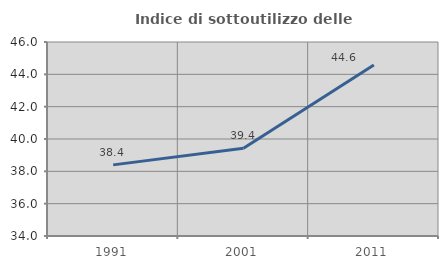
| Category | Indice di sottoutilizzo delle abitazioni  |
|---|---|
| 1991.0 | 38.4 |
| 2001.0 | 39.424 |
| 2011.0 | 44.581 |